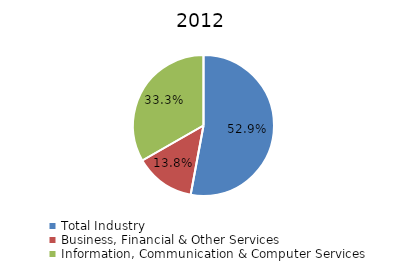
| Category | Series 0 |
|---|---|
| Total Industry | 0.529 |
| Business, Financial & Other Services | 0.138 |
| Information, Communication & Computer Services | 0.333 |